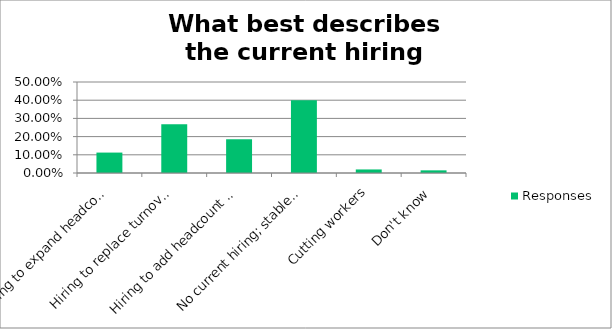
| Category | Responses |
|---|---|
| Hiring to expand headcount (only) | 0.112 |
| Hiring to replace turnover (only) | 0.268 |
| Hiring to add headcount and replace turnover | 0.185 |
| No current hiring; stable headcount | 0.4 |
| Cutting workers | 0.02 |
| Don't know | 0.015 |